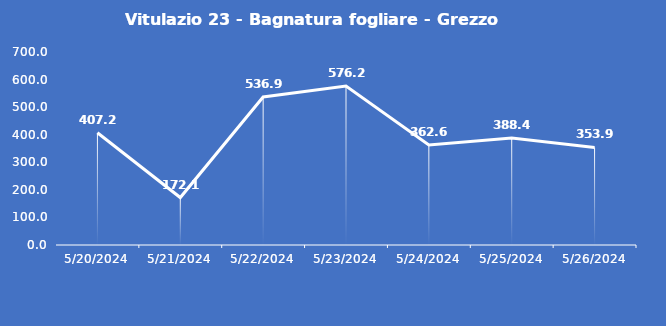
| Category | Vitulazio 23 - Bagnatura fogliare - Grezzo (min) |
|---|---|
| 5/20/24 | 407.2 |
| 5/21/24 | 172.1 |
| 5/22/24 | 536.9 |
| 5/23/24 | 576.2 |
| 5/24/24 | 362.6 |
| 5/25/24 | 388.4 |
| 5/26/24 | 353.9 |